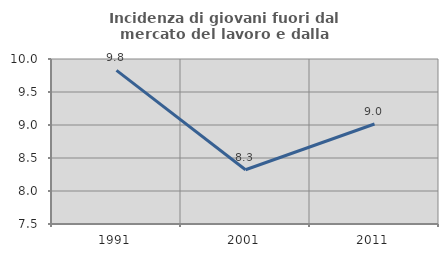
| Category | Incidenza di giovani fuori dal mercato del lavoro e dalla formazione  |
|---|---|
| 1991.0 | 9.827 |
| 2001.0 | 8.322 |
| 2011.0 | 9.015 |